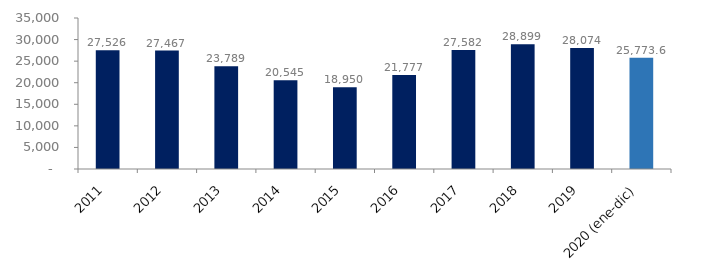
| Category | Series 1 |
|---|---|
| 2011 | 27525.675 |
| 2012 | 27466.673 |
| 2013 | 23789.445 |
| 2014 | 20545.414 |
| 2015 | 18950.14 |
| 2016 | 21776.636 |
| 2017 | 27581.607 |
| 2018 | 28898.658 |
| 2019 | 28073.793 |
| 2020 (ene-dic) | 25773.552 |